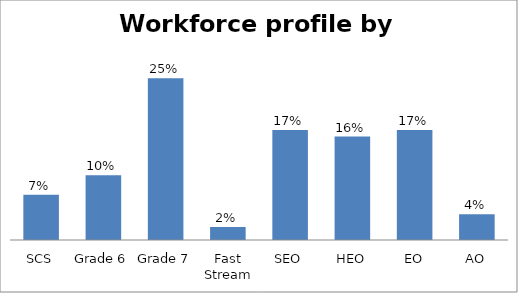
| Category | Series 0 |
|---|---|
| SCS | 0.07 |
| Grade 6 | 0.1 |
| Grade 7 | 0.25 |
| Fast Stream | 0.02 |
| SEO | 0.17 |
| HEO | 0.16 |
| EO | 0.17 |
| AO | 0.04 |